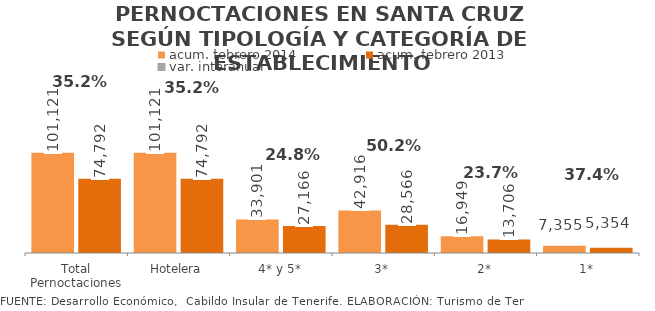
| Category | acum. febrero 2014 | acum. febrero 2013 |
|---|---|---|
| Total Pernoctaciones | 101121 | 74792 |
| Hotelera | 101121 | 74792 |
| 4* y 5* | 33901 | 27166 |
| 3* | 42916 | 28566 |
| 2* | 16949 | 13706 |
| 1* | 7355 | 5354 |